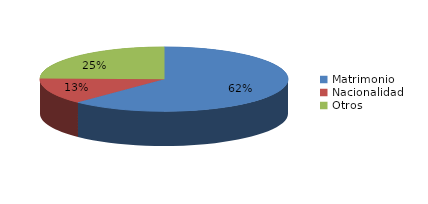
| Category | Series 0 |
|---|---|
| Matrimonio | 260 |
| Nacionalidad | 55 |
| Otros | 103 |